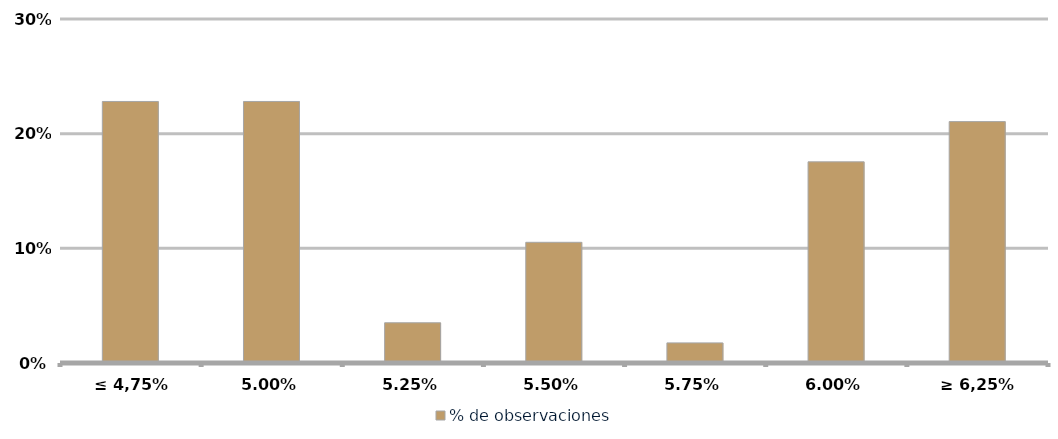
| Category | % de observaciones  |
|---|---|
| ≤ 4,75% | 0.228 |
| 5,00% | 0.228 |
| 5,25% | 0.035 |
| 5,50% | 0.105 |
| 5,75% | 0.018 |
| 6,00% | 0.175 |
| ≥ 6,25% | 0.211 |